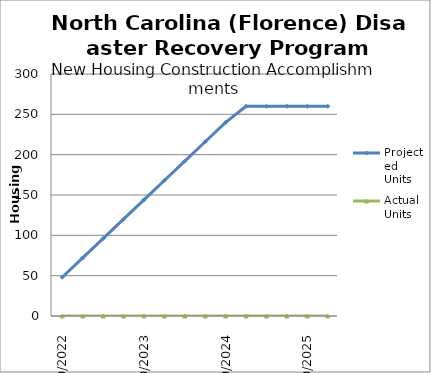
| Category | Projected Units | Actual Units |
|---|---|---|
| 10/2022 | 48 | 0 |
| 1/2023 | 72 | 0 |
| 4/2023 | 96 | 0 |
| 7/2023 | 120 | 0 |
| 10/2023 | 144 | 0 |
| 1/2024 | 168 | 0 |
| 4/2024 | 192 | 0 |
| 7/2024 | 216 | 0 |
| 10/2024 | 240 | 0 |
| 1/2025 | 260 | 0 |
| 4/2025 | 260 | 0 |
| 7/2025 | 260 | 0 |
| 10/2025 | 260 | 0 |
| 1/2026 | 260 | 0 |